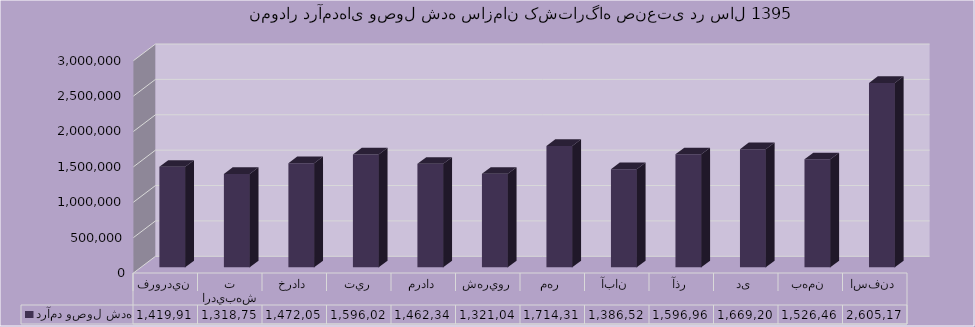
| Category | درآمد وصول شده |
|---|---|
| فروردين | 1419910 |
| ارديبهشت | 1318754 |
| خرداد | 1472051 |
| تير | 1596020 |
| مرداد | 1462347 |
| شهريور | 1321042 |
| مهر | 1714312 |
| آبان | 1386526 |
| آذر | 1596965 |
| دی | 1669200 |
| بهمن | 1526465 |
| اسفند | 2605170 |